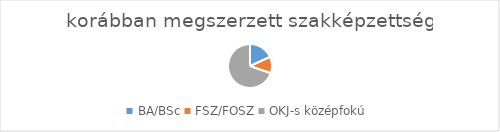
| Category | Series 0 |
|---|---|
| BA/BSc | 30 |
| FSZ/FOSZ | 20 |
| OKJ-s középfokú | 115 |